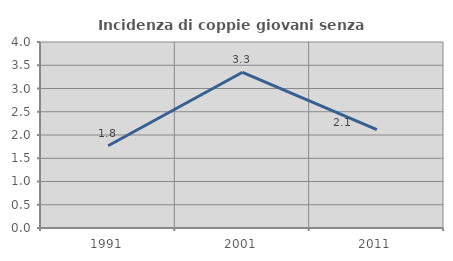
| Category | Incidenza di coppie giovani senza figli |
|---|---|
| 1991.0 | 1.77 |
| 2001.0 | 3.349 |
| 2011.0 | 2.116 |